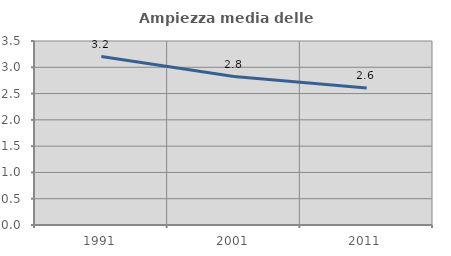
| Category | Ampiezza media delle famiglie |
|---|---|
| 1991.0 | 3.204 |
| 2001.0 | 2.824 |
| 2011.0 | 2.608 |